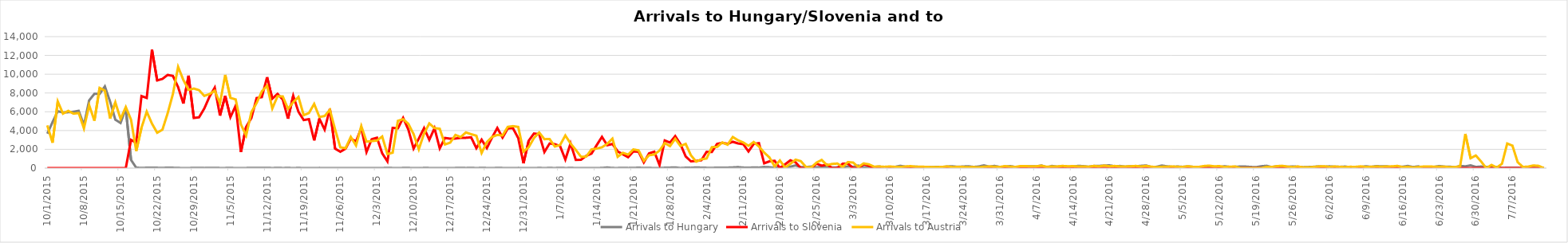
| Category | Arrivals to Hungary | Arrivals to Slovenia | Arrivals to Austria |
|---|---|---|---|
| 10/1/15 | 3667 | 0 | 4550 |
| 10/2/15 | 4897 | 0 | 2700 |
| 10/3/15 | 6056 | 0 | 7100 |
| 10/4/15 | 5925 | 0 | 5800 |
| 10/5/15 | 5952 | 0 | 6100 |
| 10/6/15 | 6000 | 0 | 5800 |
| 10/7/15 | 6103 | 0 | 5861 |
| 10/8/15 | 4583 | 6 | 4229 |
| 10/9/15 | 7215 | 0 | 6700 |
| 10/10/15 | 7907 | 0 | 5050 |
| 10/11/15 | 7897 | 0 | 8540 |
| 10/12/15 | 8702 | 0 | 8240 |
| 10/13/15 | 7081 | 0 | 5280 |
| 10/14/15 | 5157 | 0 | 7000 |
| 10/15/15 | 4808 | 0 | 5235 |
| 10/16/15 | 6353 | 0 | 6500 |
| 10/17/15 | 870 | 3000 | 5155 |
| 10/18/15 | 41 | 2700 | 1822 |
| 10/19/15 | 22 | 7677 | 4300 |
| 10/20/15 | 36 | 7478 | 6017 |
| 10/21/15 | 39 | 12616 | 4737 |
| 10/22/15 | 32 | 9339 | 3767 |
| 10/23/15 | 29 | 9500 | 4092 |
| 10/24/15 | 35 | 9925 | 5841 |
| 10/25/15 | 34 | 9818 | 7882 |
| 10/26/15 | 12 | 8625 | 10784 |
| 10/27/15 | 7 | 6877 | 9390 |
| 10/28/15 | 4 | 9848 | 8336 |
| 10/29/15 | 23 | 5341 | 8473 |
| 10/30/15 | 18 | 5409 | 8302 |
| 10/31/15 | 10 | 6344 | 7691 |
| 11/1/15 | 14 | 7611 | 7887 |
| 11/2/15 | 31 | 8568 | 8243 |
| 11/3/15 | 8 | 5591 | 6900 |
| 11/4/15 | 10 | 7693 | 9930 |
| 11/5/15 | 18 | 5426 | 7478 |
| 11/6/15 | 4 | 6655 | 7315 |
| 11/7/15 | 8 | 1716 | 4648 |
| 11/8/15 | 9 | 4381 | 3465 |
| 11/9/15 | 25 | 5341 | 5962 |
| 11/10/15 | 14 | 7457 | 6933 |
| 11/11/15 | 13 | 7554 | 8169 |
| 11/12/15 | 23 | 9681 | 8777 |
| 11/13/15 | 6 | 7397 | 6351 |
| 11/14/15 | 21 | 7905 | 7659 |
| 11/15/15 | 8 | 7300 | 7632 |
| 11/16/15 | 15 | 5261 | 6319 |
| 11/17/15 | 5 | 7704 | 7026 |
| 11/18/15 | 15 | 5998 | 7577 |
| 11/19/15 | 4 | 5119 | 5635 |
| 11/20/15 | 9 | 5211 | 5865 |
| 11/21/15 | 2 | 2952 | 6836 |
| 11/22/15 | 11 | 5260 | 5446 |
| 11/23/15 | 4 | 4102 | 5546 |
| 11/24/15 | 4 | 6297 | 6204 |
| 11/25/15 | 6 | 2070 | 4122 |
| 11/26/15 | 10 | 1742 | 2211 |
| 11/27/15 | 2 | 2065 | 2120 |
| 11/28/15 | 6 | 3139 | 3320 |
| 11/29/15 | 3 | 2843 | 2407 |
| 11/30/15 | 7 | 4274 | 4482 |
| 12/1/15 | 4 | 1709 | 2821 |
| 12/2/15 | 4 | 3077 | 2874 |
| 12/3/15 | 9 | 3237 | 2935 |
| 12/4/15 | 1 | 1577 | 3366 |
| 12/5/15 | 31 | 715 | 1493 |
| 12/6/15 | 7 | 4288 | 1643 |
| 12/7/15 | 0 | 4240 | 5035 |
| 12/8/15 | 13 | 5351 | 5210 |
| 12/9/15 | 14 | 4103 | 4714 |
| 12/10/15 | 3 | 2078 | 3623 |
| 12/11/15 | 0 | 3149 | 2000 |
| 12/12/15 | 13 | 4271 | 3675 |
| 12/13/15 | 10 | 3016 | 4754 |
| 12/14/15 | 3 | 4250 | 4263 |
| 12/15/15 | 2 | 2098 | 4193 |
| 12/16/15 | 6 | 3214 | 2519 |
| 12/17/15 | 0 | 3135 | 2717 |
| 12/18/15 | 11 | 3150 | 3532 |
| 12/19/15 | 31 | 3222 | 3305 |
| 12/20/15 | 8 | 3233 | 3800 |
| 12/21/15 | 25 | 3278 | 3611 |
| 12/22/15 | 1 | 2118 | 3451 |
| 12/23/15 | 21 | 3030 | 1613 |
| 12/24/15 | 8 | 2131 | 2764 |
| 12/25/15 | 2 | 3257 | 3321 |
| 12/26/15 | 17 | 4274 | 3532 |
| 12/27/15 | 10 | 3253 | 3476 |
| 12/28/15 | 0 | 4228 | 4394 |
| 12/29/15 | 0 | 4239 | 4468 |
| 12/30/15 | 11 | 3195 | 4386 |
| 12/31/15 | 5 | 511 | 1756 |
| 1/1/16 | 0 | 2914 | 2226 |
| 1/2/16 | 0 | 3690 | 3199 |
| 1/3/16 | 17 | 3619 | 3793 |
| 1/4/16 | 3 | 1708 | 3085 |
| 1/5/16 | 18 | 2626 | 3091 |
| 1/6/16 | 5 | 2550 | 2299 |
| 1/7/16 | 31 | 2337 | 2466 |
| 1/8/16 | 7 | 916 | 3472 |
| 1/9/16 | 15 | 2630 | 2619 |
| 1/10/16 | 6 | 880 | 1934 |
| 1/11/16 | 7 | 897 | 1204 |
| 1/12/16 | 2 | 1308 | 1231 |
| 1/13/16 | 5 | 1544 | 1991 |
| 1/14/16 | 4 | 2449 | 2082 |
| 1/15/16 | 14 | 3330 | 2219 |
| 1/16/16 | 65 | 2435 | 2578 |
| 1/17/16 | 11 | 2570 | 3141 |
| 1/18/16 | 9 | 1783 | 1203 |
| 1/19/16 | 29 | 1476 | 1630 |
| 1/20/16 | 10 | 1154 | 1439 |
| 1/21/16 | 13 | 1787 | 1989 |
| 1/22/16 | 47 | 1738 | 1885 |
| 1/23/16 | 10 | 606 | 777 |
| 1/24/16 | 15 | 1564 | 1366 |
| 1/25/16 | 5 | 1746 | 1450 |
| 1/26/16 | 4 | 326 | 1867 |
| 1/27/16 | 36 | 2935 | 2670 |
| 1/28/16 | 51 | 2719 | 2340 |
| 1/29/16 | 69 | 3416 | 3121 |
| 1/30/16 | 6 | 2556 | 2351 |
| 1/31/16 | 39 | 1249 | 2579 |
| 2/1/16 | 31 | 716 | 1367 |
| 2/2/16 | 69 | 765 | 690 |
| 2/3/16 | 46 | 841 | 937 |
| 2/4/16 | 31 | 1733 | 1026 |
| 2/5/16 | 19 | 1713 | 2235 |
| 2/6/16 | 49 | 2580 | 2252 |
| 2/7/16 | 53 | 2694 | 2737 |
| 2/8/16 | 48 | 2582 | 2490 |
| 2/9/16 | 72 | 2805 | 3314 |
| 2/10/16 | 104 | 2637 | 2968 |
| 2/11/16 | 54 | 2547 | 2731 |
| 2/12/16 | 39 | 1774 | 2378 |
| 2/13/16 | 66 | 2576 | 2781 |
| 2/14/16 | 51 | 2660 | 2301 |
| 2/15/16 | 119 | 516 | 1651 |
| 2/16/16 | 93 | 715 | 1143 |
| 2/17/16 | 34 | 769 | 181 |
| 2/18/16 | 73 | 0 | 817 |
| 2/19/16 | 113 | 407 | 50 |
| 2/20/16 | 151 | 828 | 453 |
| 2/21/16 | 288 | 623 | 899 |
| 2/22/16 | 103 | 0 | 744 |
| 2/23/16 | 112 | 0 | 111 |
| 2/24/16 | 166 | 0 | 75 |
| 2/25/16 | 76 | 478 | 583 |
| 2/26/16 | 140 | 254 | 874 |
| 2/27/16 | 111 | 382 | 321 |
| 2/28/16 | 62 | 0 | 447 |
| 2/29/16 | 78 | 0 | 487 |
| 3/1/16 | 83 | 466 | 118 |
| 3/2/16 | 181 | 479 | 644 |
| 3/3/16 | 133 | 0 | 588 |
| 3/4/16 | 268 | 0 | 114 |
| 3/5/16 | 89 | 409 | 500 |
| 3/6/16 | 72 | 253 | 402 |
| 3/7/16 | 100 | 0 | 153 |
| 3/8/16 | 167 | 0 | 171 |
| 3/9/16 | 73 | 0 | 134 |
| 3/10/16 | 70 | 0 | 172 |
| 3/11/16 | 133 | 0 | 132 |
| 3/12/16 | 245 | 0 | 116 |
| 3/13/16 | 148 | 0 | 171 |
| 3/14/16 | 123 | 0 | 211 |
| 3/15/16 | 153 | 0 | 147 |
| 3/16/16 | 104 | 0 | 150 |
| 3/17/16 | 102 | 0 | 129 |
| 3/18/16 | 95 | 0 | 107 |
| 3/19/16 | 132 | 0 | 109 |
| 3/20/16 | 107 | 0 | 126 |
| 3/21/16 | 176 | 0 | 177 |
| 3/22/16 | 188 | 0 | 103 |
| 3/23/16 | 137 | 0 | 127 |
| 3/24/16 | 171 | 0 | 121 |
| 3/25/16 | 199 | 0 | 94 |
| 3/26/16 | 125 | 0 | 104 |
| 3/27/16 | 171 | 6 | 78 |
| 3/28/16 | 293 | 0 | 144 |
| 3/29/16 | 154 | 5 | 170 |
| 3/30/16 | 234 | 4 | 152 |
| 3/31/16 | 127 | 0 | 120 |
| 4/1/16 | 142 | 0 | 210 |
| 4/2/16 | 217 | 0 | 156 |
| 4/3/16 | 119 | 0 | 122 |
| 4/4/16 | 99 | 0 | 221 |
| 4/5/16 | 176 | 2 | 203 |
| 4/6/16 | 191 | 0 | 198 |
| 4/7/16 | 178 | 0 | 196 |
| 4/8/16 | 280 | 0 | 254 |
| 4/9/16 | 83 | 0 | 138 |
| 4/10/16 | 230 | 0 | 171 |
| 4/11/16 | 149 | 0 | 171 |
| 4/12/16 | 214 | 0 | 232 |
| 4/13/16 | 150 | 0 | 193 |
| 4/14/16 | 161 | 0 | 209 |
| 4/15/16 | 237 | 0 | 176 |
| 4/16/16 | 210 | 0 | 175 |
| 4/17/16 | 144 | 0 | 148 |
| 4/18/16 | 229 | 0 | 231 |
| 4/19/16 | 235 | 0 | 183 |
| 4/20/16 | 274 | 0 | 268 |
| 4/21/16 | 294 | 0 | 195 |
| 4/22/16 | 195 | 0 | 227 |
| 4/23/16 | 226 | 0 | 174 |
| 4/24/16 | 151 | 0 | 175 |
| 4/25/16 | 202 | 0 | 191 |
| 4/26/16 | 190 | 0 | 230 |
| 4/27/16 | 241 | 0 | 172 |
| 4/28/16 | 284 | 0 | 232 |
| 4/29/16 | 108 | 0 | 151 |
| 4/30/16 | 141 | 0 | 102 |
| 5/1/16 | 274 | 0 | 136 |
| 5/2/16 | 187 | 0 | 150 |
| 5/3/16 | 131 | 0 | 173 |
| 5/4/16 | 169 | 0 | 141 |
| 5/5/16 | 133 | 0 | 128 |
| 5/6/16 | 178 | 0 | 201 |
| 5/7/16 | 132 | 0 | 129 |
| 5/8/16 | 75 | 0 | 121 |
| 5/9/16 | 124 | 0 | 218 |
| 5/10/16 | 128 | 0 | 260 |
| 5/11/16 | 120 | 0 | 191 |
| 5/12/16 | 89 | 0 | 210 |
| 5/13/16 | 201 | 0 | 120 |
| 5/14/16 | 120 | 0 | 150 |
| 5/15/16 | 139 | 0 | 169 |
| 5/16/16 | 169 | 0 | 0 |
| 5/17/16 | 164 | 0 | 0 |
| 5/18/16 | 121 | 0 | 0 |
| 5/19/16 | 100 | 0 | 0 |
| 5/20/16 | 198 | 0 | 0 |
| 5/21/16 | 245 | 0 | 138 |
| 5/22/16 | 108 | 0 | 122 |
| 5/23/16 | 193 | 0 | 210 |
| 5/24/16 | 198 | 0 | 245 |
| 5/25/16 | 139 | 0 | 156 |
| 5/26/16 | 181 | 0 | 107 |
| 5/27/16 | 144 | 0 | 170 |
| 5/28/16 | 92 | 0 | 79 |
| 5/29/16 | 115 | 0 | 77 |
| 5/30/16 | 140 | 0 | 122 |
| 5/31/16 | 182 | 0 | 177 |
| 6/1/16 | 138 | 0 | 196 |
| 6/2/16 | 187 | 0 | 132 |
| 6/3/16 | 146 | 0 | 167 |
| 6/4/16 | 135 | 0 | 135 |
| 6/5/16 | 164 | 0 | 107 |
| 6/6/16 | 100 | 0 | 140 |
| 6/7/16 | 131 | 0 | 132 |
| 6/8/16 | 104 | 0 | 185 |
| 6/9/16 | 201 | 0 | 122 |
| 6/10/16 | 129 | 0 | 141 |
| 6/11/16 | 219 | 0 | 165 |
| 6/12/16 | 181 | 0 | 152 |
| 6/13/16 | 189 | 0 | 171 |
| 6/14/16 | 95 | 0 | 184 |
| 6/15/16 | 155 | 0 | 235 |
| 6/16/16 | 147 | 0 | 96 |
| 6/17/16 | 230 | 0 | 139 |
| 6/18/16 | 114 | 0 | 66 |
| 6/19/16 | 185 | 0 | 109 |
| 6/20/16 | 47 | 0 | 167 |
| 6/21/16 | 52 | 0 | 179 |
| 6/22/16 | 125 | 0 | 151 |
| 6/23/16 | 223 | 0 | 142 |
| 6/24/16 | 159 | 0 | 149 |
| 6/25/16 | 159 | 0 | 95 |
| 6/26/16 | 75 | 0 | 101 |
| 6/27/16 | 238 | 0 | 201 |
| 6/28/16 | 186 | 0 | 3645 |
| 6/29/16 | 295 | 0 | 1050 |
| 6/30/16 | 125 | 0 | 1344 |
| 7/1/16 | 167 | 0 | 711 |
| 7/2/16 | 133 | 0 | 0 |
| 7/3/16 | 134 | 0 | 338 |
| 7/4/16 | 99 | 0 | 54 |
| 7/5/16 | 30 | 0 | 461 |
| 7/6/16 | 33 | 0 | 2619 |
| 7/7/16 | 38 | 0 | 2391 |
| 7/8/16 | 32 | 0 | 630 |
| 7/9/16 | 31 | 0 | 125 |
| 7/10/16 | 48 | 0 | 157 |
| 7/11/16 | 29 | 0 | 281 |
| 7/12/16 | 30 | 0 | 241 |
| 7/13/16 | 33 | 0 | 0 |